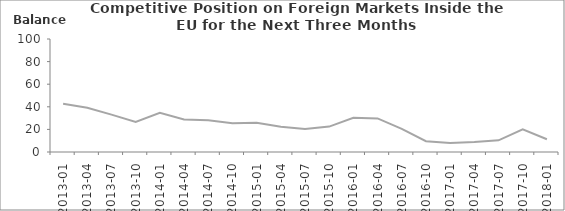
| Category | Balance |
|---|---|
| 2013-01 | 42.7 |
| 2013-04 | 39.2 |
| 2013-07 | 33.1 |
| 2013-10 | 26.6 |
| 2014-01 | 34.7 |
| 2014-04 | 28.7 |
| 2014-07 | 28.1 |
| 2014-10 | 25.4 |
| 2015-01 | 25.8 |
| 2015-04 | 22.3 |
| 2015-07 | 20.3 |
| 2015-10 | 22.5 |
| 2016-01 | 30.2 |
| 2016-04 | 29.7 |
| 2016-07 | 20.4 |
| 2016-10 | 9.5 |
| 2017-01 | 8 |
| 2017-04 | 8.9 |
| 2017-07 | 10.3 |
| 2017-10 | 20.1 |
| 2018-01 | 11.3 |